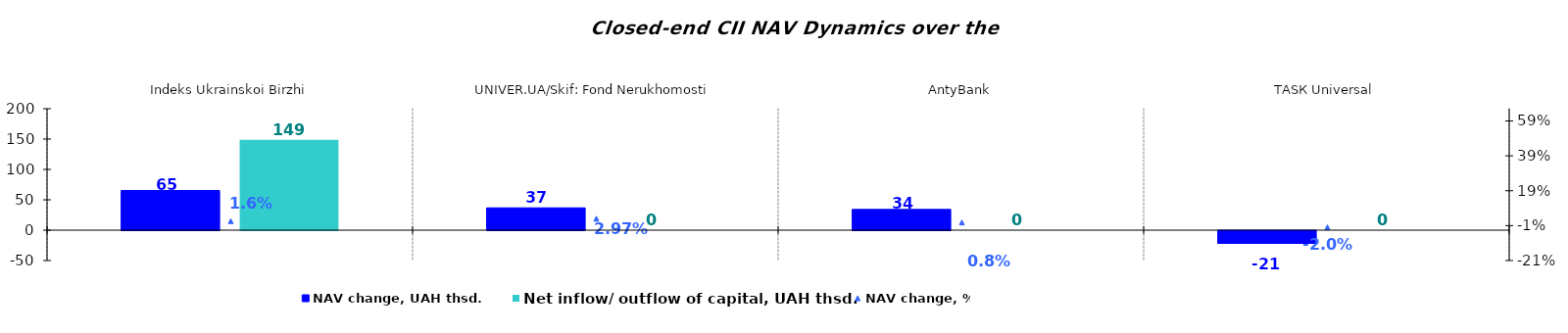
| Category | NAV change, UAH thsd. | Net inflow/ outflow of capital, UAH thsd. |
|---|---|---|
| Indeks Ukrainskoi Birzhi | 65.337 | 148.961 |
| UNIVER.UA/Skif: Fond Nerukhomosti | 36.766 | 0 |
| AntyBank | 34.158 | 0 |
| ТАSК Universal | -20.92 | 0 |